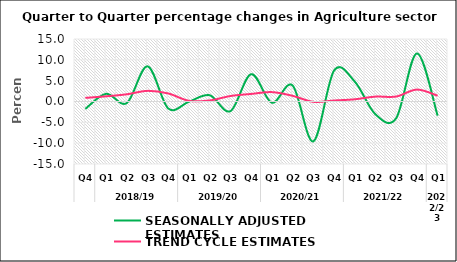
| Category | SEASONALLY ADJUSTED ESTIMATES | TREND CYCLE ESTIMATES |
|---|---|---|
| 0 | -1.774 | 0.868 |
| 1 | 1.847 | 1.247 |
| 2 | -0.378 | 1.73 |
| 3 | 8.441 | 2.551 |
| 4 | -1.671 | 1.93 |
| 5 | -0.045 | 0.164 |
| 6 | 1.506 | 0.246 |
| 7 | -2.321 | 1.318 |
| 8 | 6.557 | 1.813 |
| 9 | -0.305 | 2.253 |
| 10 | 3.852 | 1.364 |
| 11 | -9.58 | -0.079 |
| 12 | 7.408 | 0.235 |
| 13 | 4.783 | 0.529 |
| 14 | -3.089 | 1.171 |
| 15 | -4.002 | 1.191 |
| 16 | 11.536 | 2.861 |
| 17 | -3.4 | 1.393 |